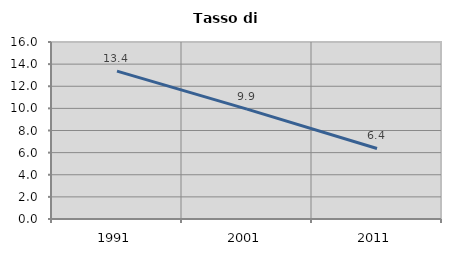
| Category | Tasso di disoccupazione   |
|---|---|
| 1991.0 | 13.367 |
| 2001.0 | 9.934 |
| 2011.0 | 6.378 |